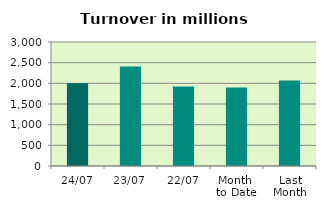
| Category | Series 0 |
|---|---|
| 24/07 | 2004.021 |
| 23/07 | 2404.957 |
| 22/07 | 1924.454 |
| Month 
to Date | 1896.633 |
| Last
Month | 2071.376 |